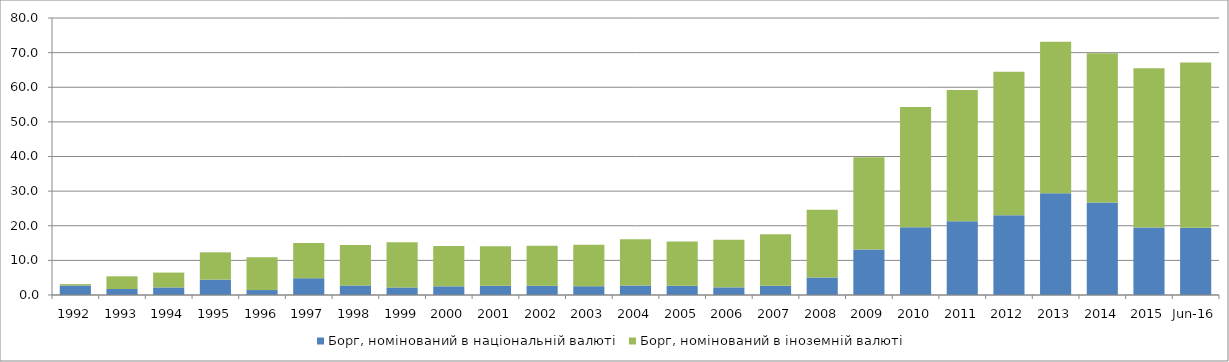
| Category | Борг, номінований в національній валюті | Борг, номінований в іноземній валюті |
|---|---|---|
| 1992.0 | 2.743 | 0.404 |
| 1993.0 | 1.732 | 3.661 |
| 1994.0 | 2.184 | 4.292 |
| 1995.0 | 4.433 | 7.895 |
| 1996.0 | 1.427 | 9.468 |
| 1997.0 | 4.845 | 10.164 |
| 1998.0 | 2.759 | 11.647 |
| 1999.0 | 2.176 | 13.072 |
| 2000.0 | 2.507 | 11.657 |
| 2001.0 | 2.65 | 11.419 |
| 2002.0 | 2.694 | 11.508 |
| 2003.0 | 2.533 | 12.01 |
| 2004.0 | 2.766 | 13.331 |
| 2005.0 | 2.666 | 12.809 |
| 2006.0 | 2.205 | 13.745 |
| 2007.0 | 2.69 | 14.883 |
| 2008.0 | 5.06 | 19.539 |
| 2009.0 | 13.143 | 26.67 |
| 2010.0 | 19.538 | 34.76 |
| 2011.0 | 21.329 | 37.894 |
| 2012.0 | 23.046 | 41.449 |
| 2013.0 | 29.397 | 43.765 |
| 2014.0 | 26.747 | 43.065 |
| 2015.0 | 19.515 | 45.99 |
| 42551.0 | 19.448 | 47.669 |